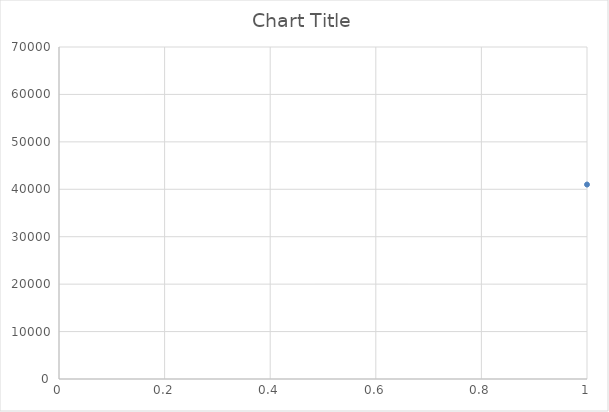
| Category | Series 0 |
|---|---|
| 0 | 41000 |
| 1 | 41500 |
| 2 | 41000 |
| 3 | 50500 |
| 4 | 31800 |
| 5 | 31400 |
| 6 | 31000 |
| 7 | 31800 |
| 8 | 42000 |
| 9 | 43500 |
| 10 | 31600 |
| 11 | 31600 |
| 12 | 31000 |
| 13 | 31600 |
| 14 | 31800 |
| 15 | 31400 |
| 16 | 31000 |
| 17 | 31800 |
| 18 | 42500 |
| 19 | 44500 |
| 20 | 42000 |
| 21 | 43500 |
| 22 | 9800 |
| 23 | 13000 |
| 24 | 19000 |
| 25 | 9000 |
| 26 | 12200 |
| 27 | 18000 |
| 28 | 24000 |
| 29 | 9800 |
| 30 | 9800 |
| 31 | 12000 |
| 32 | 18000 |
| 33 | 25000 |
| 34 | 23600 |
| 35 | 24000 |
| 36 | 23800 |
| 37 | 33400 |
| 38 | 35404 |
| 39 | 35738 |
| 40 | 33400 |
| 41 | 45500 |
| 42 | 46500 |
| 43 | 55500 |
| 44 | 19000 |
| 45 | 19000 |
| 46 | 48000 |
| 47 | 48000 |
| 48 | 23000 |
| 49 | 23000 |
| 50 | 28000 |
| 51 | 36000 |
| 52 | 36000 |
| 53 | 23600 |
| 54 | 24000 |
| 55 | 23800 |
| 56 | 33400 |
| 57 | 35404 |
| 58 | 35738 |
| 59 | 33400 |
| 60 | 45500 |
| 61 | 46500 |
| 62 | 55500 |
| 63 | 55500 |
| 64 | 33400 |
| 65 | 45500 |
| 66 | 23600 |
| 67 | 18000 |
| 68 | 18000 |
| 69 | 24000 |
| 70 | 11800 |
| 71 | 10900 |
| 72 | 18000 |
| 73 | 18000 |
| 74 | 19000 |
| 75 | 24000 |
| 76 | 28000 |
| 77 | 9000 |
| 78 | 13000 |
| 79 | 19000 |
| 80 | 10900 |
| 81 | 11800 |
| 82 | 24000 |
| 83 | 18000 |
| 84 | 18900 |
| 85 | 24000 |
| 86 | 18940 |
| 87 | 24000 |
| 88 | 23400 |
| 89 | 23600 |
| 90 | 35000 |
| 91 | 45500 |
| 92 | 50000 |
| 93 | 12000 |
| 94 | 16000 |
| 95 | 18000 |
| 96 | 12000 |
| 97 | 14400 |
| 98 | 18000 |
| 99 | 21600 |
| 100 | 25400 |
| 101 | 18295 |
| 102 | 18056 |
| 103 | 13679 |
| 104 | 10089 |
| 105 | 10942 |
| 106 | 10000 |
| 107 | 13500 |
| 108 | 16200 |
| 109 | 21600 |
| 110 | 11000 |
| 111 | 13000 |
| 112 | 8806.37 |
| 113 | 10900 |
| 114 | 11800 |
| 115 | 24000 |
| 116 | 24000 |
| 117 | 23250 |
| 118 | 10800 |
| 119 | 13300 |
| 120 | 27000 |
| 121 | 13600 |
| 122 | 22000 |
| 123 | 25000 |
| 124 | 36400 |
| 125 | 54000 |
| 126 | 42000 |
| 127 | 12000 |
| 128 | 16000 |
| 129 | 12000 |
| 130 | 12000 |
| 131 | 16000 |
| 132 | 16000 |
| 133 | 12000 |
| 134 | 16000 |
| 135 | 18000 |
| 136 | 12000 |
| 137 | 16000 |
| 138 | 18000 |
| 139 | 16000 |
| 140 | 18000 |
| 141 | 16000 |
| 142 | 18000 |
| 143 | 12000 |
| 144 | 12000 |
| 145 | 12000 |
| 146 | 12000 |
| 147 | 16000 |
| 148 | 16000 |
| 149 | 18000 |
| 150 | 18000 |
| 151 | 21600 |
| 152 | 21600 |
| 153 | 21850 |
| 154 | 22600 |
| 155 | 12000 |
| 156 | 16000 |
| 157 | 18000 |
| 158 | 21850 |
| 159 | 12000 |
| 160 | 10000 |
| 161 | 24400 |
| 162 | 19000 |
| 163 | 28000 |
| 164 | 48000 |
| 165 | 28000 |
| 166 | 36000 |
| 167 | 10000 |
| 168 | 12000 |
| 169 | 25000 |
| 170 | 12000 |
| 171 | 24000 |
| 172 | 11800 |
| 173 | 10900 |
| 174 | 10900 |
| 175 | 11800 |
| 176 | 24000 |
| 177 | 9800 |
| 178 | 18000 |
| 179 | 25000 |
| 180 | 10900 |
| 181 | 12000 |
| 182 | 24000 |
| 183 | 10000 |
| 184 | 12000 |
| 185 | 25000 |
| 186 | 12000 |
| 187 | 11000 |
| 188 | 12000 |
| 189 | 9800 |
| 190 | 9800 |
| 191 | 12000 |
| 192 | 12000 |
| 193 | 18000 |
| 194 | 18000 |
| 195 | 25000 |
| 196 | 25000 |
| 197 | 18000 |
| 198 | 24000 |
| 199 | 24000 |
| 200 | 10000 |
| 201 | 10000 |
| 202 | 12000 |
| 203 | 12000 |
| 204 | 18000 |
| 205 | 18000 |
| 206 | 24400 |
| 207 | 24400 |
| 208 | 10000 |
| 209 | 12000 |
| 210 | 18000 |
| 211 | 10900 |
| 212 | 9800 |
| 213 | 11800 |
| 214 | 12000 |
| 215 | 18000 |
| 216 | 24000 |
| 217 | 25000 |
| 218 | 24400 |
| 219 | 9800 |
| 220 | 18000 |
| 221 | 25000 |
| 222 | 18000 |
| 223 | 24000 |
| 224 | 9000 |
| 225 | 12200 |
| 226 | 18000 |
| 227 | 24000 |
| 228 | 29000 |
| 229 | 30000 |
| 230 | 42500 |
| 231 | 9000 |
| 232 | 18000 |
| 233 | 24000 |
| 234 | 12200 |
| 235 | 29000 |
| 236 | 30000 |
| 237 | 42500 |
| 238 | 9000 |
| 239 | 13000 |
| 240 | 19000 |
| 241 | 18000 |
| 242 | 24000 |
| 243 | 9000 |
| 244 | 12200 |
| 245 | 9000 |
| 246 | 12600 |
| 247 | 16000 |
| 248 | 22000 |
| 249 | 27700 |
| 250 | 10000 |
| 251 | 12000 |
| 252 | 16500 |
| 253 | 20400 |
| 254 | 9000 |
| 255 | 9000 |
| 256 | 9000 |
| 257 | 9000 |
| 258 | 9000 |
| 259 | 9000 |
| 260 | 9000 |
| 261 | 13000 |
| 262 | 13000 |
| 263 | 13000 |
| 264 | 13000 |
| 265 | 13000 |
| 266 | 13000 |
| 267 | 13000 |
| 268 | 19000 |
| 269 | 19000 |
| 270 | 19000 |
| 271 | 19000 |
| 272 | 19000 |
| 273 | 19000 |
| 274 | 19000 |
| 275 | 33200 |
| 276 | 33000 |
| 277 | 28000 |
| 278 | 36000 |
| 279 | 10900 |
| 280 | 12000 |
| 281 | 24000 |
| 282 | 10900 |
| 283 | 12000 |
| 284 | 12000 |
| 285 | 24000 |
| 286 | 13600 |
| 287 | 22000 |
| 288 | 27000 |
| 289 | 24000 |
| 290 | 36000 |
| 291 | 23250 |
| 292 | 32000 |
| 293 | 54000 |
| 294 | 20000 |
| 295 | 27600 |
| 296 | 27000 |
| 297 | 10800 |
| 298 | 10800 |
| 299 | 13300 |
| 300 | 13300 |
| 301 | 12000 |
| 302 | 11000 |
| 303 | 22000 |
| 304 | 18000 |
| 305 | 45000 |
| 306 | 22000 |
| 307 | 26000 |
| 308 | 28600 |
| 309 | 40000 |
| 310 | 41000 |
| 311 | 41000 |
| 312 | 45000 |
| 313 | 45000 |
| 314 | 27000 |
| 315 | 40000 |
| 316 | 48000 |
| 317 | 45000 |
| 318 | 45000 |
| 319 | 22000 |
| 320 | 42000 |
| 321 | 54000 |
| 322 | 66000 |
| 323 | 42000 |
| 324 | 66000 |
| 325 | 28600 |
| 326 | 25000 |
| 327 | 42000 |
| 328 | 28600 |
| 329 | 25000 |
| 330 | 13600 |
| 331 | 21600 |
| 332 | 38000 |
| 333 | 38000 |
| 334 | 38000 |
| 335 | 27600 |
| 336 | 10900 |
| 337 | 13600 |
| 338 | 10900 |
| 339 | 13600 |
| 340 | 18000 |
| 341 | 13600 |
| 342 | 10900 |
| 343 | 18540 |
| 344 | 10900 |
| 345 | 13600 |
| 346 | 10900 |
| 347 | 14400 |
| 348 | 18000 |
| 349 | 21600 |
| 350 | 26000 |
| 351 | 38000 |
| 352 | 20300 |
| 353 | 18000 |
| 354 | 8700 |
| 355 | 8700 |
| 356 | 20300 |
| 357 | 13000 |
| 358 | 11000 |
| 359 | 21000 |
| 360 | 21600 |
| 361 | 22400 |
| 362 | 34400 |
| 363 | 22400 |
| 364 | 34400 |
| 365 | 26000 |
| 366 | 12000 |
| 367 | 13800 |
| 368 | 21600 |
| 369 | 10900 |
| 370 | 13600 |
| 371 | 9000 |
| 372 | 11500 |
| 373 | 18000 |
| 374 | 28600 |
| 375 | 25000 |
| 376 | 22000 |
| 377 | 12000 |
| 378 | 32000 |
| 379 | 40000 |
| 380 | 12000 |
| 381 | 32000 |
| 382 | 40000 |
| 383 | 12600 |
| 384 | 13600 |
| 385 | 27000 |
| 386 | 12000 |
| 387 | 14000 |
| 388 | 11000 |
| 389 | 10800 |
| 390 | 18000 |
| 391 | 20200 |
| 392 | 20200 |
| 393 | 42500 |
| 394 | 32200 |
| 395 | 41000 |
| 396 | 20000 |
| 397 | 41500 |
| 398 | 32000 |
| 399 | 31800 |
| 400 | 31200 |
| 401 | 32600 |
| 402 | 32000 |
| 403 | 32000 |
| 404 | 31800 |
| 405 | 31200 |
| 406 | 32600 |
| 407 | 31600 |
| 408 | 31000 |
| 409 | 30400 |
| 410 | 30800 |
| 411 | 31800 |
| 412 | 43000 |
| 413 | 33800 |
| 414 | 32800 |
| 415 | 33200 |
| 416 | 33000 |
| 417 | 32800 |
| 418 | 33200 |
| 419 | 43500 |
| 420 | 20200 |